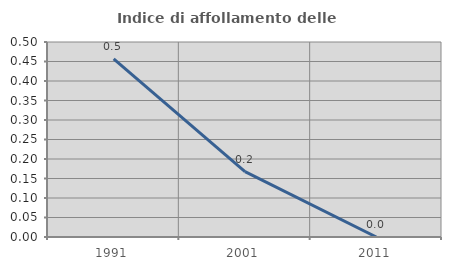
| Category | Indice di affollamento delle abitazioni  |
|---|---|
| 1991.0 | 0.457 |
| 2001.0 | 0.168 |
| 2011.0 | 0 |